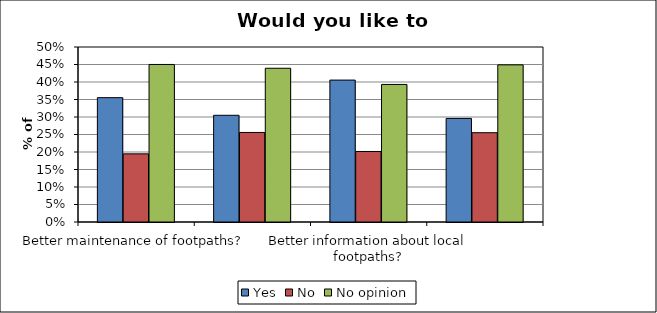
| Category | Yes | No | No opinion |
|---|---|---|---|
| Better maintenance of footpaths? | 0.355 | 0.195 | 0.45 |
| Better signage of footpaths? | 0.305 | 0.256 | 0.439 |
| Better information about local footpaths? | 0.405 | 0.201 | 0.393 |
| More footpaths? | 0.296 | 0.255 | 0.449 |